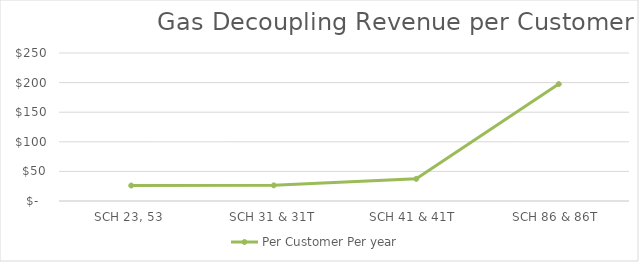
| Category | Per Customer Per year  |
|---|---|
| SCH 23, 53 | 26.136 |
| SCH 31 & 31T | 26.422 |
| SCH 41 & 41T  | 37.427 |
| SCH 86 & 86T  | 197.473 |